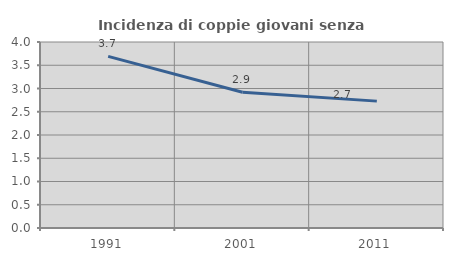
| Category | Incidenza di coppie giovani senza figli |
|---|---|
| 1991.0 | 3.69 |
| 2001.0 | 2.92 |
| 2011.0 | 2.729 |